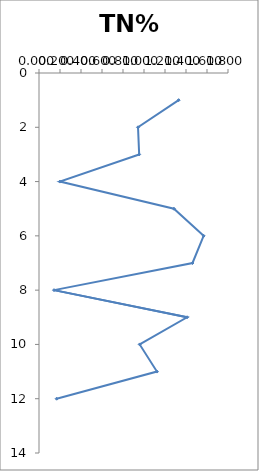
| Category | TN% |
|---|---|
| 1.33 | 1 |
| 0.943 | 2 |
| 0.954 | 3 |
| 0.199 | 4 |
| 1.285 | 5 |
| 1.568 | 6 |
| 1.462 | 7 |
| 0.143 | 8 |
| 1.41 | 9 |
| 0.959 | 10 |
| 1.123 | 11 |
| 0.168 | 12 |